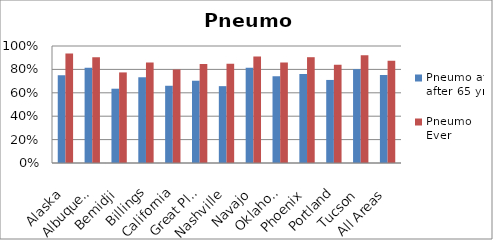
| Category | Pneumo at/ after 65 yrs | Pneumo Ever |
|---|---|---|
| Alaska | 0.751 | 0.936 |
| Albuquerque | 0.815 | 0.904 |
| Bemidji | 0.635 | 0.774 |
| Billings | 0.733 | 0.858 |
| California | 0.66 | 0.8 |
| Great Plains | 0.703 | 0.846 |
| Nashville | 0.657 | 0.848 |
| Navajo | 0.815 | 0.911 |
| Oklahoma | 0.741 | 0.859 |
| Phoenix | 0.76 | 0.904 |
| Portland | 0.71 | 0.839 |
| Tucson | 0.802 | 0.921 |
| All Areas | 0.751 | 0.874 |